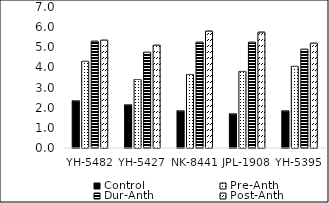
| Category | Control | Pre-Anth | Dur-Anth | Post-Anth |
|---|---|---|---|---|
| YH-5482 | 2.35 | 4.3 | 5.3 | 5.35 |
| YH-5427 | 2.15 | 3.4 | 4.75 | 5.1 |
| NK-8441 | 1.85 | 3.65 | 5.25 | 5.8 |
| JPL-1908 | 1.7 | 3.8 | 5.25 | 5.75 |
| YH-5395 | 1.85 | 4.05 | 4.9 | 5.2 |